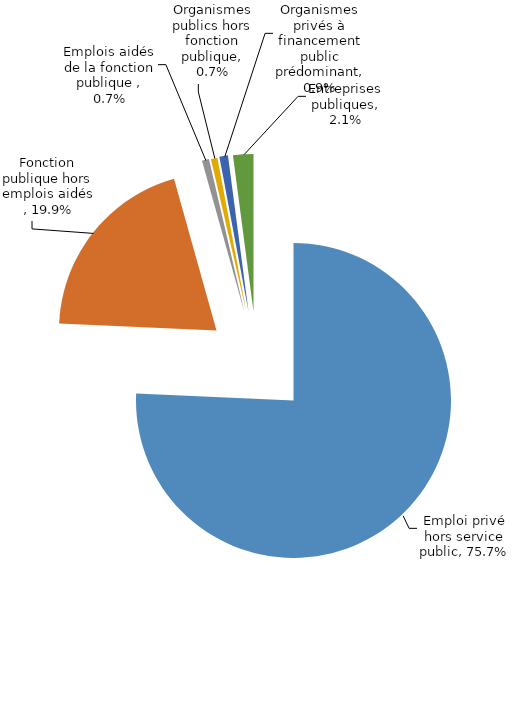
| Category | Series 0 |
|---|---|
| Emploi privé hors service public | 0.757 |
| Fonction publique hors emplois aidés  | 0.199 |
| Emplois aidés de la fonction publique  | 0.007 |
| Organismes publics hors fonction publique | 0.007 |
| Organismes privés à financement public prédominant | 0.009 |
| Entreprises publiques | 0.021 |